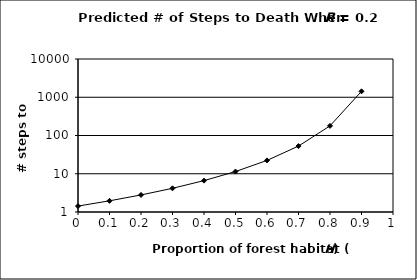
| Category | Series 0 |
|---|---|
| 0.9 | 1428.571 |
| 0.8 | 178.571 |
| 0.7 | 52.91 |
| 0.6 | 22.321 |
| 0.5 | 11.429 |
| 0.4 | 6.614 |
| 0.3 | 4.165 |
| 0.2 | 2.79 |
| 0.1 | 1.96 |
| 0.0 | 1.429 |